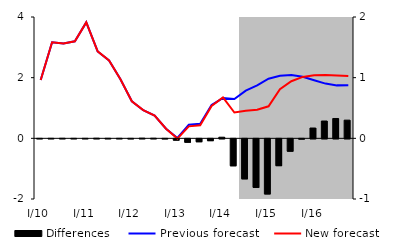
| Category | Differences |
|---|---|
| I/10 | 0 |
| II | 0 |
| III | 0.001 |
| IV | 0 |
| I/11 | 0 |
| II | 0.002 |
| III | 0.001 |
| IV | 0.001 |
| I/12 | -0.001 |
| II | 0.003 |
| III | 0.002 |
| IV | -0.001 |
| I/13 | -0.022 |
| II | -0.056 |
| III | -0.048 |
| IV | -0.03 |
| I/14 | 0.018 |
| II | -0.444 |
| III | -0.66 |
| IV | -0.801 |
| I/15 | -0.909 |
| II | -0.442 |
| III | -0.204 |
| IV | -0.005 |
| I/16 | 0.17 |
| II | 0.285 |
| III | 0.327 |
| IV | 0.3 |